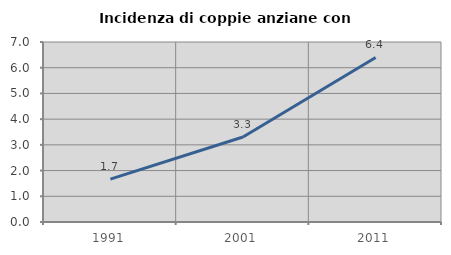
| Category | Incidenza di coppie anziane con figli |
|---|---|
| 1991.0 | 1.667 |
| 2001.0 | 3.306 |
| 2011.0 | 6.4 |